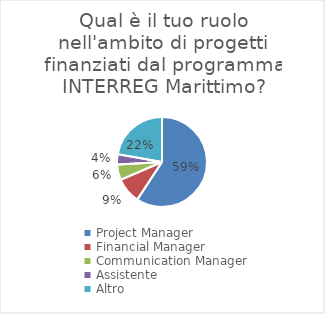
| Category | Qual è il tuo ruolo nell'ambito di progetti finanziati dal programma INTERREG Marittimo? |
|---|---|
| Project Manager | 0.593 |
| Financial Manager | 0.093 |
| Communication Manager | 0.056 |
| Assistente | 0.037 |
| Altro | 0.222 |